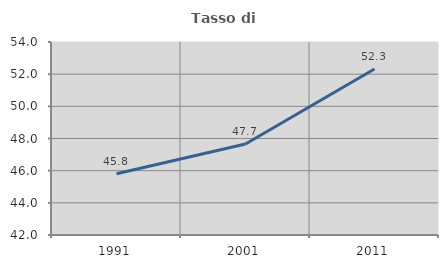
| Category | Tasso di occupazione   |
|---|---|
| 1991.0 | 45.808 |
| 2001.0 | 47.66 |
| 2011.0 | 52.322 |